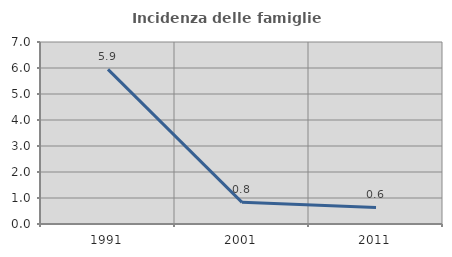
| Category | Incidenza delle famiglie numerose |
|---|---|
| 1991.0 | 5.948 |
| 2001.0 | 0.834 |
| 2011.0 | 0.638 |